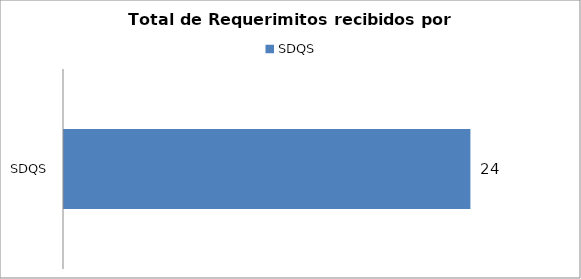
| Category | Total |
|---|---|
| SDQS | 24 |